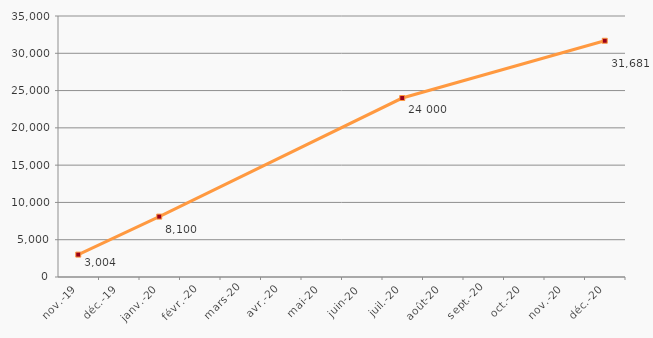
| Category | Sollicitations du  service |
|---|---|
| 2019-11-01 | 3004 |
| 2020-01-01 | 8100 |
| 2020-07-01 | 24000 |
| 2020-12-01 | 31681 |